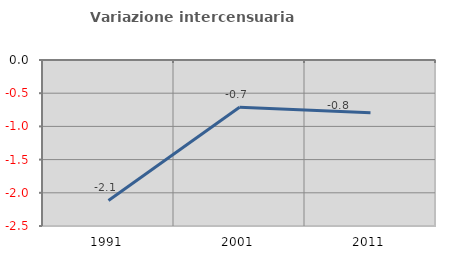
| Category | Variazione intercensuaria annua |
|---|---|
| 1991.0 | -2.116 |
| 2001.0 | -0.712 |
| 2011.0 | -0.796 |